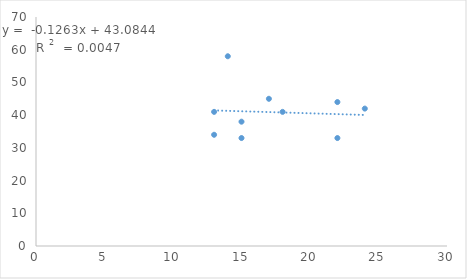
| Category | Series 0 |
|---|---|
| 14.0 | 58 |
| 17.0 | 45 |
| 18.0 | 41 |
| 13.0 | 34 |
| 13.0 | 41 |
| 24.0 | 42 |
| 15.0 | 38 |
| 15.0 | 33 |
| 22.0 | 33 |
| 22.0 | 44 |